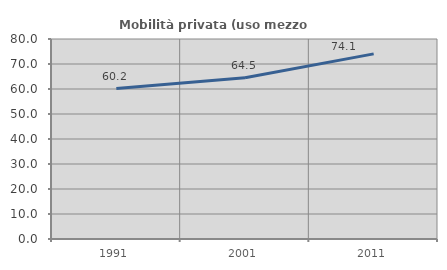
| Category | Mobilità privata (uso mezzo privato) |
|---|---|
| 1991.0 | 60.19 |
| 2001.0 | 64.47 |
| 2011.0 | 74.054 |